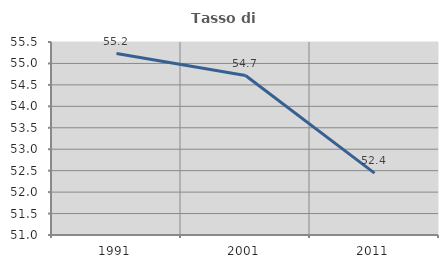
| Category | Tasso di occupazione   |
|---|---|
| 1991.0 | 55.231 |
| 2001.0 | 54.717 |
| 2011.0 | 52.442 |